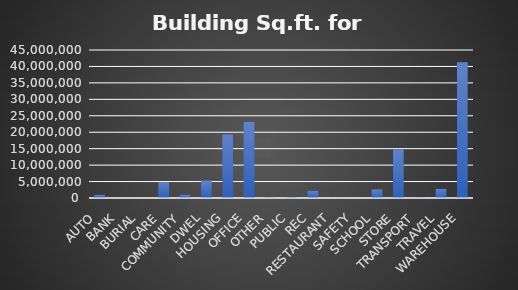
| Category | Series 0 |
|---|---|
| AUTO  | 984616 |
| BANK  | 0 |
| BURIAL  | 0 |
| CARE  | 4826434 |
| COMMUNITY  | 1033853 |
| DWEL  | 5328718 |
| HOUSING  | 19330820 |
| OFFICE  | 23237354 |
| OTHER  | 193087 |
| PUBLIC  | 300535 |
| REC  | 2196487 |
| RESTAURANT  | 45788 |
| SAFETY  | 38400 |
| SCHOOL  | 2615554 |
| STORE  | 14806275 |
| TRANSPORT  | 198700 |
| TRAVEL  | 2790479 |
| WAREHOUSE  | 41292391 |